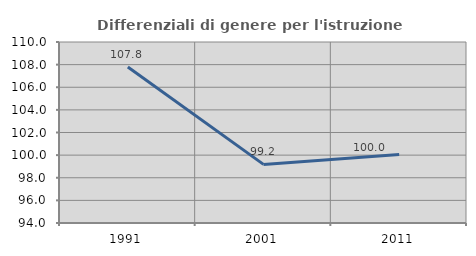
| Category | Differenziali di genere per l'istruzione superiore |
|---|---|
| 1991.0 | 107.79 |
| 2001.0 | 99.181 |
| 2011.0 | 100.047 |